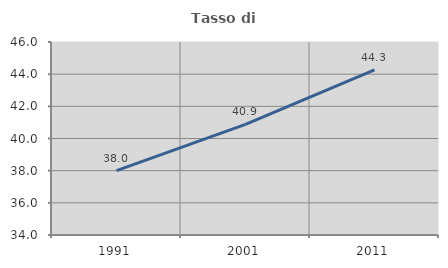
| Category | Tasso di occupazione   |
|---|---|
| 1991.0 | 38.007 |
| 2001.0 | 40.873 |
| 2011.0 | 44.269 |